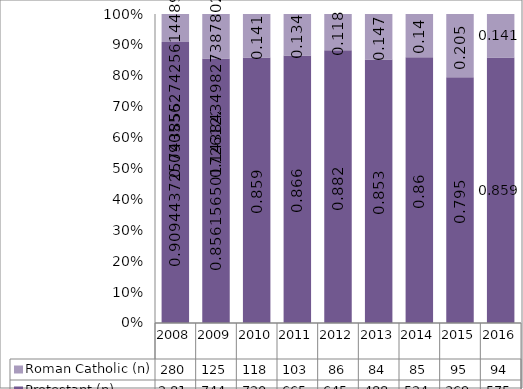
| Category | Protestant (n) | Roman Catholic (n) |
|---|---|---|
| 2008.0 | 2812 | 280 |
| 2009.0 | 744 | 125 |
| 2010.0 | 720 | 118 |
| 2011.0 | 665 | 103 |
| 2012.0 | 645 | 86 |
| 2013.0 | 488 | 84 |
| 2014.0 | 524 | 85 |
| 2015.0 | 369 | 95 |
| 2016.0 | 575 | 94 |